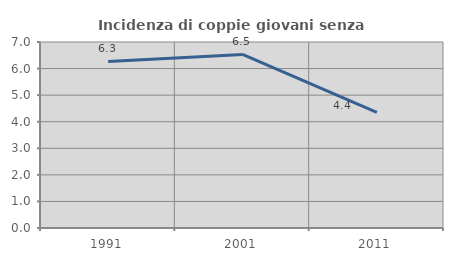
| Category | Incidenza di coppie giovani senza figli |
|---|---|
| 1991.0 | 6.266 |
| 2001.0 | 6.534 |
| 2011.0 | 4.353 |